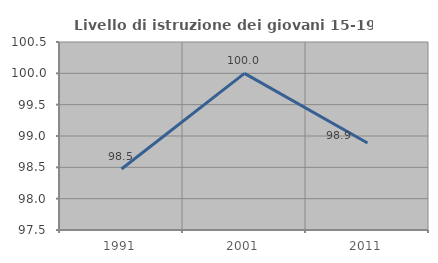
| Category | Livello di istruzione dei giovani 15-19 anni |
|---|---|
| 1991.0 | 98.473 |
| 2001.0 | 100 |
| 2011.0 | 98.889 |